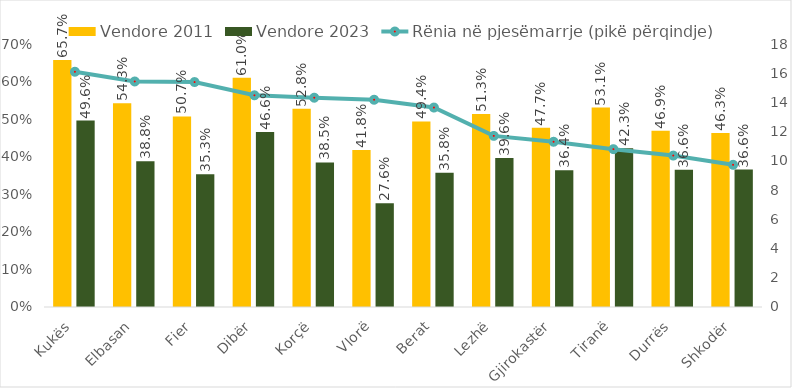
| Category | Vendore 2011 | Vendore 2023 |
|---|---|---|
| Kukës | 0.657 | 0.496 |
| Elbasan | 0.543 | 0.388 |
| Fier | 0.507 | 0.353 |
| Dibër | 0.61 | 0.466 |
| Korçë | 0.528 | 0.385 |
| Vlorë | 0.418 | 0.276 |
| Berat | 0.494 | 0.358 |
| Lezhë | 0.513 | 0.396 |
| Gjirokastër | 0.477 | 0.364 |
| Tiranë | 0.531 | 0.423 |
| Durrës | 0.469 | 0.366 |
| Shkodër | 0.463 | 0.366 |